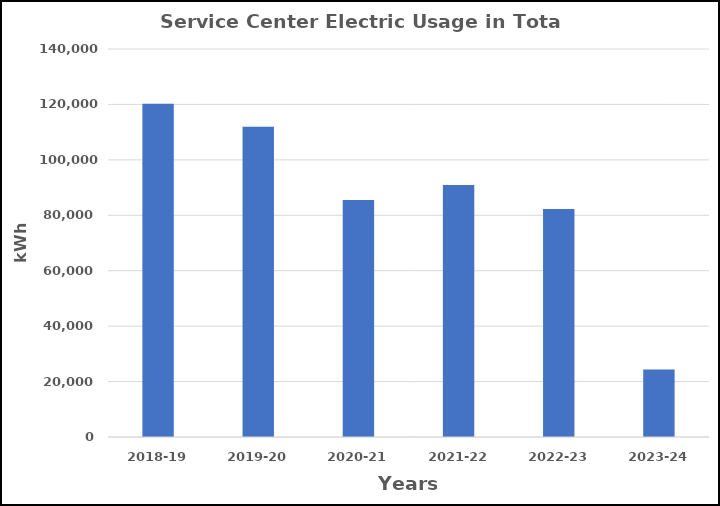
| Category | Series 0 |
|---|---|
| 2018-19 | 120210 |
| 2019-20 | 111928 |
| 2020-21 | 85539 |
| 2021-22 | 90940 |
| 2022-23 | 82263 |
| 2023-24 | 24365 |